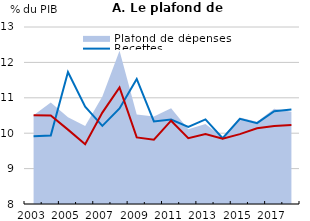
| Category | Recettes | Dépenses |
|---|---|---|
| 2003.0 | 9.917 | 10.506 |
| 2004.0 | 9.936 | 10.503 |
| 2005.0 | 11.726 | 10.101 |
| 2006.0 | 10.751 | 9.689 |
| 2007.0 | 10.208 | 10.582 |
| 2008.0 | 10.699 | 11.293 |
| 2009.0 | 11.533 | 9.88 |
| 2010.0 | 10.333 | 9.817 |
| 2011.0 | 10.387 | 10.354 |
| 2012.0 | 10.177 | 9.858 |
| 2013.0 | 10.392 | 9.978 |
| 2014.0 | 9.86 | 9.846 |
| 2015.0 | 10.406 | 9.974 |
| 2016.0 | 10.284 | 10.14 |
| 2017.0 | 10.623 | 10.204 |
| 2018.0 | 10.669 | 10.23 |